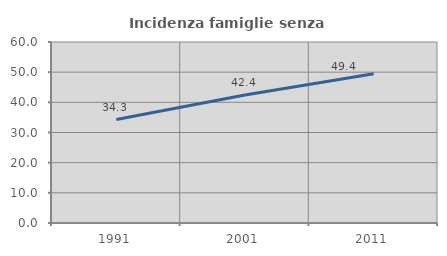
| Category | Incidenza famiglie senza nuclei |
|---|---|
| 1991.0 | 34.302 |
| 2001.0 | 42.424 |
| 2011.0 | 49.444 |